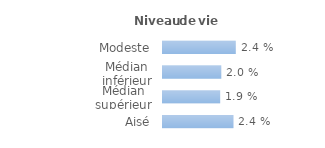
| Category | Series 0 |
|---|---|
| Modeste | 0.024 |
| Médian inférieur | 0.02 |
| Médian supérieur | 0.019 |
| Aisé | 0.024 |